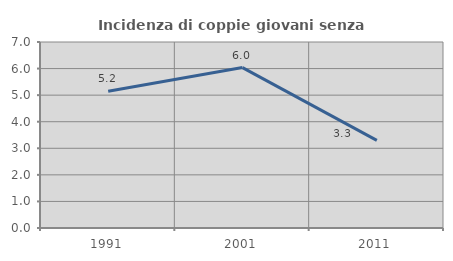
| Category | Incidenza di coppie giovani senza figli |
|---|---|
| 1991.0 | 5.15 |
| 2001.0 | 6.038 |
| 2011.0 | 3.297 |